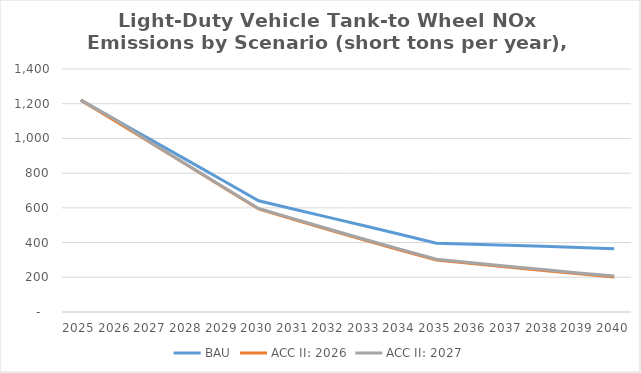
| Category | BAU | ACC II: 2026 | ACC II: 2027 |
|---|---|---|---|
| 2025.0 | 1220.642 | 1220.642 | 1220.642 |
| 2026.0 | 1104.67 | 1096.739 | 1104.67 |
| 2027.0 | 989.128 | 971.097 | 972.404 |
| 2028.0 | 873.381 | 845.322 | 847.296 |
| 2029.0 | 757.311 | 718.823 | 721.446 |
| 2030.0 | 640.641 | 593.504 | 596.6 |
| 2031.0 | 592.408 | 532.743 | 536.495 |
| 2032.0 | 543.953 | 472.276 | 476.568 |
| 2033.0 | 495.368 | 413.147 | 417.803 |
| 2034.0 | 446.66 | 355.762 | 360.596 |
| 2035.0 | 396.308 | 299.583 | 304.38 |
| 2036.0 | 390.734 | 278.851 | 283.988 |
| 2037.0 | 384.846 | 258.622 | 263.951 |
| 2038.0 | 378.598 | 238.928 | 244.312 |
| 2039.0 | 372.065 | 219.885 | 225.136 |
| 2040.0 | 365.07 | 202.003 | 206.915 |